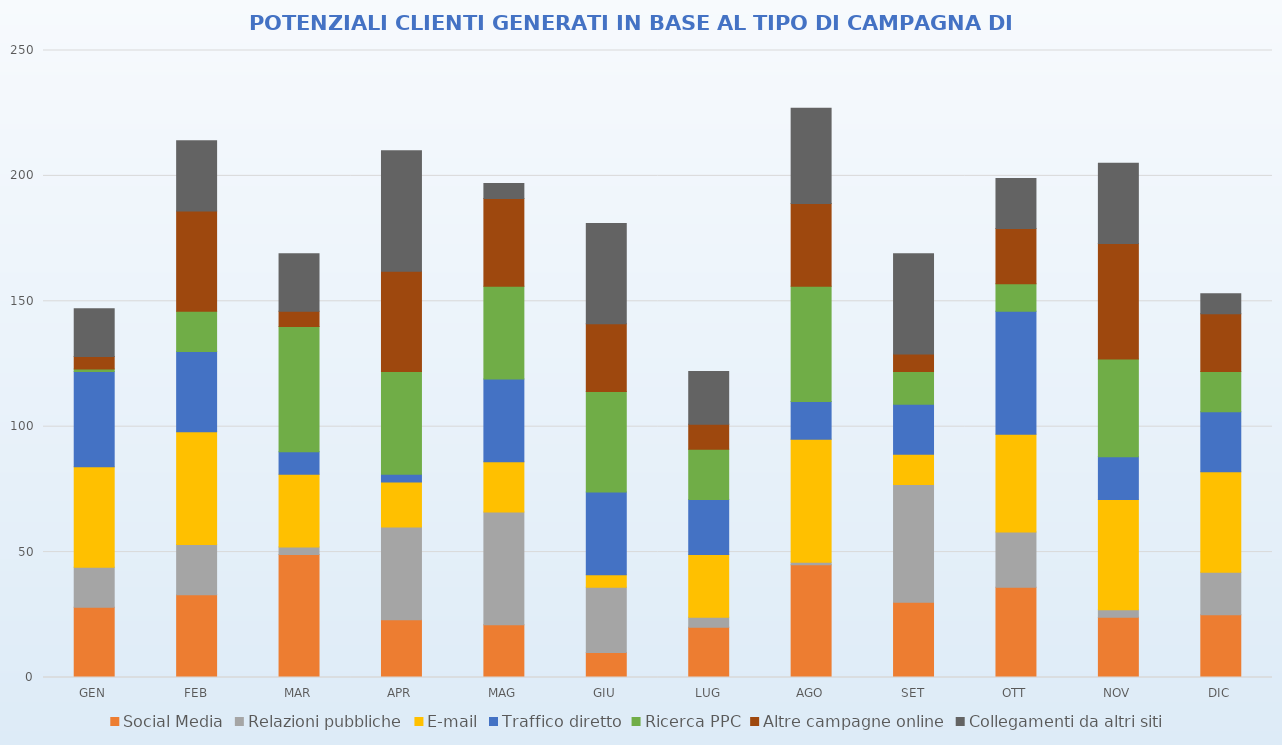
| Category | Social Media | Relazioni pubbliche | E-mail | Traffico diretto | Ricerca PPC | Altre campagne online | Collegamenti da altri siti |
|---|---|---|---|---|---|---|---|
| GEN | 28 | 16 | 40 | 38 | 1 | 5 | 19 |
| FEB | 33 | 20 | 45 | 32 | 16 | 40 | 28 |
| MAR | 49 | 3 | 29 | 9 | 50 | 6 | 23 |
| APR | 23 | 37 | 18 | 3 | 41 | 40 | 48 |
| MAG | 21 | 45 | 20 | 33 | 37 | 35 | 6 |
| GIU | 10 | 26 | 5 | 33 | 40 | 27 | 40 |
| LUG | 20 | 4 | 25 | 22 | 20 | 10 | 21 |
| AGO | 45 | 1 | 49 | 15 | 46 | 33 | 38 |
| SET | 30 | 47 | 12 | 20 | 13 | 7 | 40 |
| OTT | 36 | 22 | 39 | 49 | 11 | 22 | 20 |
| NOV | 24 | 3 | 44 | 17 | 39 | 46 | 32 |
| DIC | 25 | 17 | 40 | 24 | 16 | 23 | 8 |